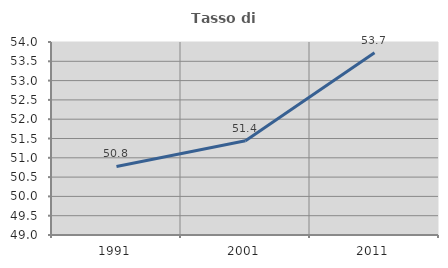
| Category | Tasso di occupazione   |
|---|---|
| 1991.0 | 50.777 |
| 2001.0 | 51.442 |
| 2011.0 | 53.72 |